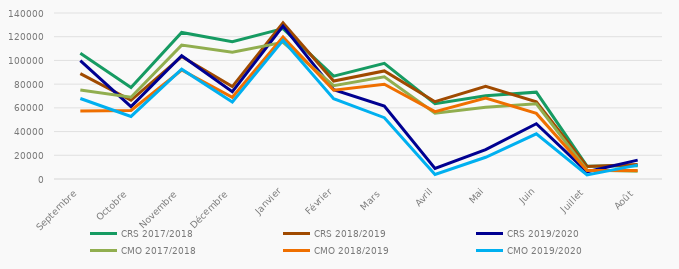
| Category | CRS | CMO |
|---|---|---|
| Septembre | 99753 | 67904 |
| Octobre | 61012 | 52770 |
| Novembre | 103972 | 92644 |
| Décembre | 73617 | 64990 |
| Janvier | 128952 | 117035 |
| Février | 75365 | 67694 |
| Mars | 61477 | 51739 |
| Avril | 8941 | 3822 |
| Mai | 24844 | 18350 |
| Juin | 46637 | 38117 |
| Juillet | 6052 | 3380 |
| Août | 15910 | 11719 |